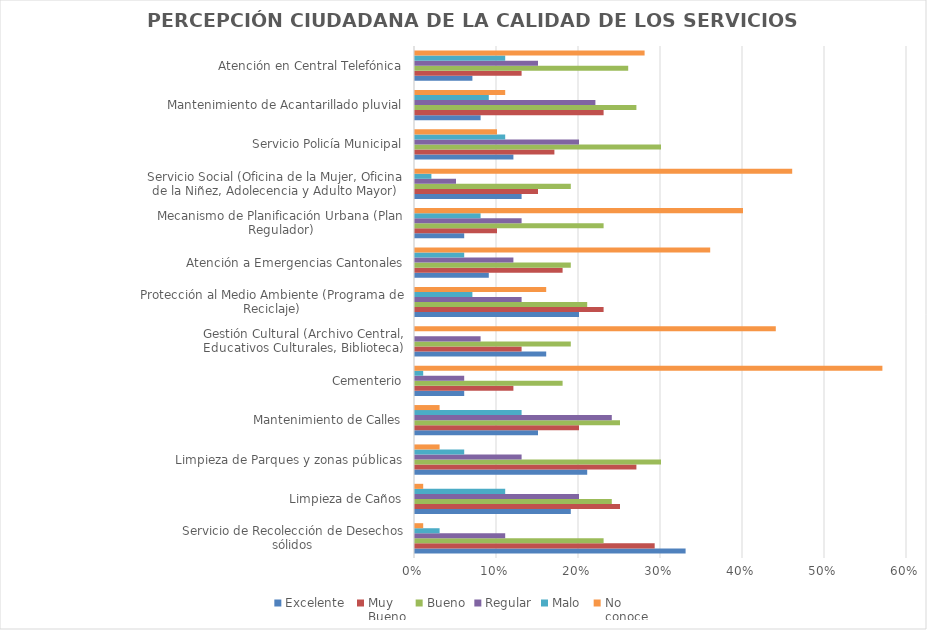
| Category | Excelente  | Muy 
Bueno | Bueno | Regular | Malo  | No
conoce |
|---|---|---|---|---|---|---|
| Servicio de Recolección de Desechos sólidos | 0.33 | 0.292 | 0.23 | 0.11 | 0.03 | 0.01 |
| Limpieza de Caños | 0.19 | 0.25 | 0.24 | 0.2 | 0.11 | 0.01 |
| Limpieza de Parques y zonas públicas | 0.21 | 0.27 | 0.3 | 0.13 | 0.06 | 0.03 |
| Mantenimiento de Calles | 0.15 | 0.2 | 0.25 | 0.24 | 0.13 | 0.03 |
| Cementerio | 0.06 | 0.12 | 0.18 | 0.06 | 0.01 | 0.57 |
| Gestión Cultural (Archivo Central, Educativos Culturales, Biblioteca) | 0.16 | 0.13 | 0.19 | 0.08 | 0 | 0.44 |
| Protección al Medio Ambiente (Programa de Reciclaje) | 0.2 | 0.23 | 0.21 | 0.13 | 0.07 | 0.16 |
| Atención a Emergencias Cantonales | 0.09 | 0.18 | 0.19 | 0.12 | 0.06 | 0.36 |
| Mecanismo de Planificación Urbana (Plan Regulador) | 0.06 | 0.1 | 0.23 | 0.13 | 0.08 | 0.4 |
| Servicio Social (Oficina de la Mujer, Oficina de la Niñez, Adolecencia y Adulto Mayor) | 0.13 | 0.15 | 0.19 | 0.05 | 0.02 | 0.46 |
| Servicio Policía Municipal | 0.12 | 0.17 | 0.3 | 0.2 | 0.11 | 0.1 |
| Mantenimiento de Acantarillado pluvial | 0.08 | 0.23 | 0.27 | 0.22 | 0.09 | 0.11 |
| Atención en Central Telefónica | 0.07 | 0.13 | 0.26 | 0.15 | 0.11 | 0.28 |